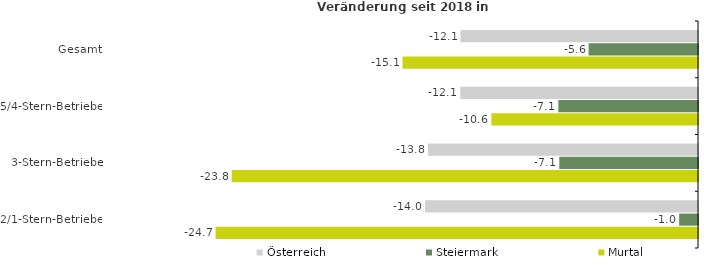
| Category | Österreich | Steiermark | Murtal |
|---|---|---|---|
| Gesamt | -12.137 | -5.59 | -15.099 |
| 5/4-Stern-Betriebe | -12.15 | -7.138 | -10.559 |
| 3-Stern-Betriebe | -13.805 | -7.09 | -23.831 |
| 2/1-Stern-Betriebe | -13.951 | -0.963 | -24.657 |